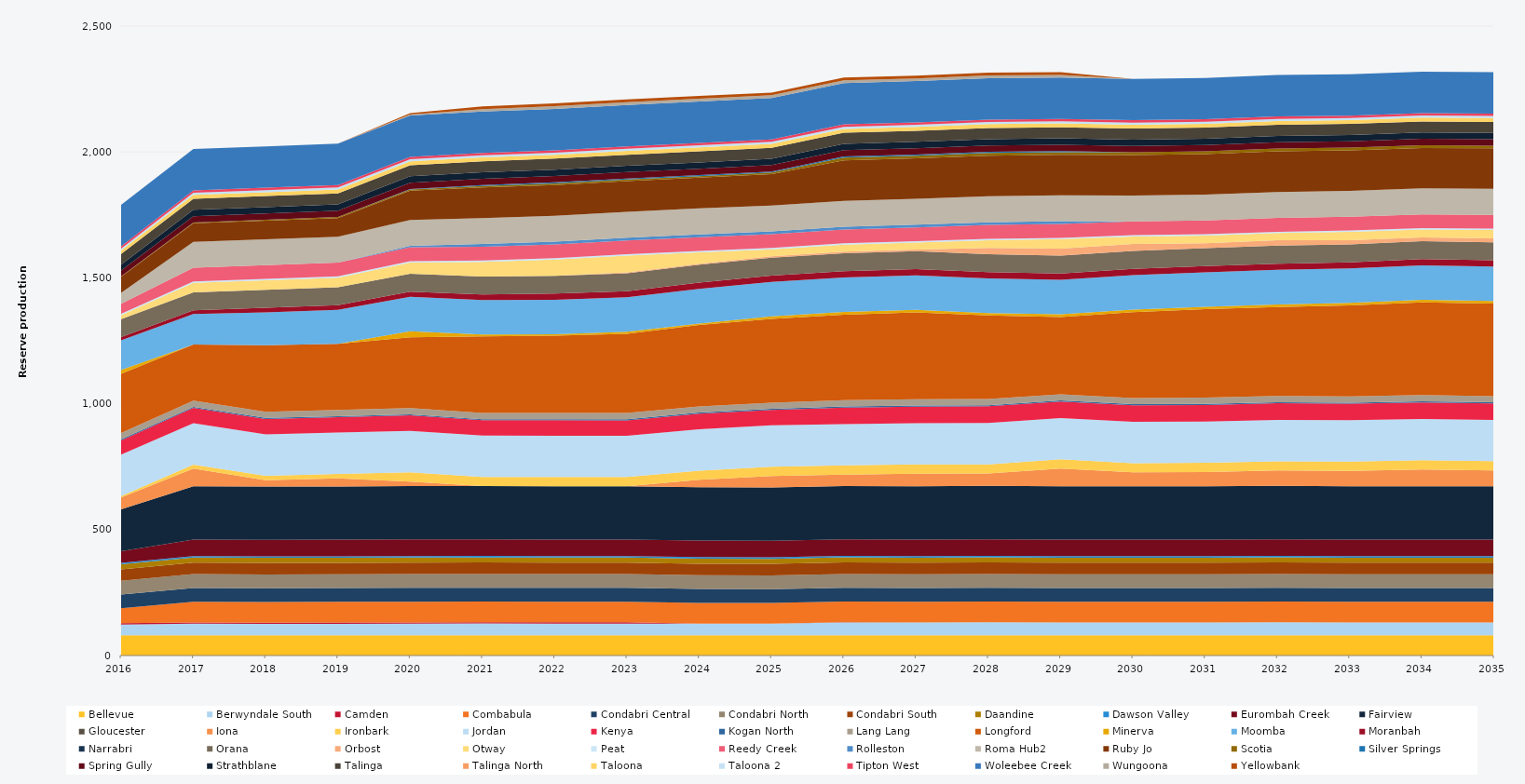
| Category | Bellevue | Berwyndale South | Camden | Combabula | Condabri Central | Condabri North | Condabri South | Daandine | Dawson Valley | Eurombah Creek | Fairview | Gloucester | Iona | Ironbark | Jordan | Kenya | Kogan North | Lang Lang | Longford | Minerva | Moomba | Moranbah | Narrabri | Orana | Orbost | Otway | Peat | Reedy Creek | Rolleston | Roma Hub2 | Ruby Jo | Scotia | Silver Springs | Spring Gully | Strathblane | Talinga | Talinga North | Taloona | Taloona 2 | Tipton West | Woleebee Creek | Wungoona | Yellowbank |
|---|---|---|---|---|---|---|---|---|---|---|---|---|---|---|---|---|---|---|---|---|---|---|---|---|---|---|---|---|---|---|---|---|---|---|---|---|---|---|---|---|---|---|---|
| 2016 | 80.52 | 42.569 | 5 | 59.72 | 54.531 | 54.233 | 45.411 | 20.13 | 5.856 | 46.485 | 166.484 | 0 | 46.481 | 5.468 | 164.7 | 57.139 | 4.392 | 24.522 | 235.041 | 16 | 117.302 | 13.144 | 0 | 71 | 0 | 15.606 | 5.49 | 39.37 | 0 | 43.648 | 64.114 | 1.431 | 0 | 23.636 | 22.628 | 43.268 | 0 | 13.215 | 7.494 | 9.516 | 164.7 | 0 | 0 |
| 2017 | 80.3 | 46.35 | 5 | 82.125 | 54.75 | 54.75 | 45.625 | 20.075 | 5.84 | 65.7 | 211.7 | 0 | 69.931 | 16.286 | 164.25 | 60.717 | 4.38 | 24.455 | 222.562 | 0 | 121.253 | 14.794 | 0 | 71.175 | 0 | 38 | 5.475 | 54.75 | 0 | 102.93 | 73.702 | 2.892 | 0 | 25.185 | 25.185 | 43.8 | 0 | 15.33 | 8.395 | 9.49 | 164.25 | 0 | 0 |
| 2018 | 80.3 | 45.256 | 5 | 82.125 | 54.75 | 54.75 | 45.625 | 20.075 | 5.84 | 65.7 | 211.7 | 0 | 24.61 | 18.209 | 164.25 | 60.986 | 4.38 | 24.455 | 264.315 | 0 | 130.904 | 17.995 | 0 | 71.175 | 0 | 38 | 5.475 | 54.75 | 0 | 102.93 | 73.702 | 3.443 | 0 | 25.185 | 25.185 | 43.8 | 0 | 15.33 | 8.395 | 9.49 | 164.25 | 0 | 0 |
| 2019 | 80.3 | 45.809 | 5 | 82.125 | 54.75 | 54.75 | 45.625 | 20.075 | 5.84 | 65.7 | 211.7 | 0 | 31.568 | 18.25 | 164.25 | 60.637 | 4.38 | 24.455 | 262.5 | 0 | 135.35 | 18.062 | 0 | 71.175 | 0 | 38 | 5.475 | 54.75 | 0 | 102.93 | 73.702 | 4.369 | 0 | 25.185 | 25.185 | 43.8 | 0 | 15.33 | 8.395 | 9.49 | 164.25 | 0 | 0 |
| 2020 | 80.52 | 45.819 | 5 | 82.35 | 54.9 | 54.9 | 45.75 | 20.13 | 5.856 | 65.88 | 212.28 | 0 | 17.669 | 36.6 | 164.7 | 61.465 | 4.392 | 24.522 | 281.351 | 23.79 | 137.25 | 19.632 | 0 | 71.37 | 0 | 44.818 | 5.49 | 54.9 | 5.586 | 103.212 | 116.254 | 4.854 | 1.484 | 25.254 | 25.254 | 43.92 | 0 | 15.372 | 8.418 | 9.516 | 164.7 | 3.712 | 5.638 |
| 2021 | 80.3 | 46.989 | 5 | 82.125 | 54.75 | 54.75 | 45.625 | 20.075 | 5.84 | 65.7 | 211.7 | 0 | 0 | 36.5 | 164.25 | 60.789 | 4.38 | 24.455 | 304.277 | 7.135 | 136.875 | 22.187 | 0 | 71.175 | 0 | 58.198 | 5.475 | 54.75 | 10.95 | 102.93 | 121.796 | 5.913 | 3.738 | 25.185 | 25.185 | 43.8 | 0 | 15.33 | 8.395 | 9.49 | 164.25 | 9.515 | 10.95 |
| 2022 | 80.3 | 46.551 | 5 | 82.125 | 54.75 | 54.75 | 45.625 | 20.075 | 5.84 | 65.7 | 211.7 | 0 | 0 | 36.5 | 164.25 | 61.28 | 4.38 | 24.455 | 306.648 | 6.283 | 136.875 | 24.144 | 0 | 71.175 | 0 | 64.339 | 5.475 | 54.75 | 10.95 | 102.93 | 121.752 | 6.351 | 4.38 | 25.185 | 25.185 | 43.8 | 0 | 15.33 | 8.395 | 9.49 | 164.25 | 10.95 | 10.95 |
| 2023 | 80.3 | 46.453 | 5 | 82.125 | 54.75 | 54.75 | 45.625 | 20.075 | 5.84 | 65.7 | 211.7 | 0 | 0 | 36.5 | 164.25 | 61.08 | 4.38 | 24.455 | 315.098 | 7.541 | 136.875 | 24.788 | 0 | 71.175 | 3.364 | 66.645 | 5.475 | 54.75 | 10.95 | 102.93 | 121.708 | 6.12 | 4.38 | 25.185 | 25.185 | 43.8 | 0 | 15.33 | 8.395 | 9.49 | 164.25 | 10.95 | 10.95 |
| 2024 | 80.52 | 46.257 | 0 | 82.35 | 54.9 | 54.9 | 45.75 | 20.13 | 5.856 | 65.88 | 212.28 | 0 | 28.83 | 36.6 | 164.7 | 61.672 | 4.392 | 24.522 | 323.245 | 5.909 | 137.25 | 24.888 | 0 | 71.37 | 3.84 | 45.403 | 5.49 | 54.9 | 10.98 | 103.212 | 121.963 | 5.751 | 4.392 | 25.254 | 25.254 | 43.92 | 0 | 15.372 | 8.418 | 9.516 | 164.7 | 10.98 | 10.98 |
| 2025 | 80.3 | 46.408 | 0 | 82.125 | 54.75 | 54.75 | 45.625 | 20.075 | 5.84 | 65.7 | 211.7 | 0 | 45.992 | 36.5 | 164.25 | 61.512 | 4.38 | 24.455 | 332.757 | 9.817 | 136.875 | 24.82 | 0 | 71.175 | 6.262 | 27.248 | 5.475 | 54.75 | 10.95 | 102.93 | 124.413 | 6.236 | 4.38 | 25.185 | 25.185 | 43.8 | 0 | 15.33 | 8.395 | 9.49 | 164.25 | 10.95 | 10.95 |
| 2026 | 80.3 | 51.1 | 1 | 82.125 | 54.75 | 54.75 | 45.625 | 20.075 | 5.84 | 65.7 | 211.7 | 0 | 45.664 | 36.5 | 164.25 | 65.7 | 4.38 | 24.455 | 339.537 | 11.376 | 136.875 | 24.82 | 0 | 71.175 | 6.381 | 27.884 | 5.475 | 54.75 | 10.95 | 102.93 | 160.6 | 10.95 | 4.38 | 25.185 | 25.185 | 43.8 | 0 | 15.33 | 8.395 | 9.49 | 164.25 | 10.95 | 10.95 |
| 2027 | 80.3 | 51.1 | 0 | 82.125 | 54.75 | 54.75 | 45.625 | 20.075 | 5.84 | 65.7 | 211.7 | 0 | 50.291 | 36.5 | 164.25 | 65.7 | 4.38 | 24.455 | 345.189 | 10.059 | 136.875 | 24.82 | 0 | 71.175 | 6.937 | 27.178 | 5.475 | 54.75 | 10.95 | 102.93 | 160.6 | 10.95 | 4.38 | 25.185 | 25.185 | 43.8 | 0 | 15.33 | 8.395 | 9.49 | 164.25 | 10.95 | 10.95 |
| 2028 | 80.52 | 51.24 | 0 | 82.35 | 54.9 | 54.9 | 45.75 | 20.13 | 5.856 | 65.88 | 212.28 | 0 | 48.895 | 36.6 | 164.7 | 65.88 | 4.392 | 24.522 | 332.301 | 9.34 | 137.25 | 24.888 | 0 | 71.37 | 24.931 | 30.75 | 5.49 | 54.9 | 10.98 | 103.212 | 161.04 | 10.98 | 4.392 | 25.254 | 25.254 | 43.92 | 0 | 15.372 | 8.418 | 9.516 | 164.7 | 10.98 | 10.98 |
| 2029 | 80.3 | 51.1 | 0 | 82.125 | 54.75 | 54.75 | 45.625 | 20.075 | 5.84 | 65.7 | 211.7 | 0 | 70.492 | 36.5 | 164.25 | 65.7 | 4.38 | 24.455 | 306.869 | 10.94 | 136.875 | 24.82 | 0 | 71.175 | 27.375 | 37.838 | 5.475 | 54.75 | 10.92 | 102.93 | 160.6 | 10.95 | 4.38 | 25.185 | 25.185 | 43.8 | 0 | 15.33 | 8.395 | 9.49 | 164.25 | 10.95 | 10.877 |
| 2030 | 80.3 | 51.1 | 0 | 82.125 | 54.75 | 54.75 | 45.625 | 20.075 | 5.84 | 65.7 | 211.7 | 0 | 55.654 | 36.5 | 164.25 | 65.7 | 4.38 | 24.455 | 341.19 | 9.885 | 136.875 | 24.82 | 0 | 71.175 | 27.375 | 29.71 | 5.475 | 54.75 | 0 | 102.93 | 160.6 | 10.95 | 0 | 25.185 | 25.185 | 43.8 | 0 | 15.33 | 8.395 | 9.49 | 164.25 | 0 | 0 |
| 2031 | 80.3 | 51.1 | 0 | 82.125 | 54.75 | 54.75 | 45.625 | 20.075 | 5.84 | 65.7 | 211.7 | 0 | 56.705 | 36.5 | 164.25 | 65.7 | 4.38 | 24.455 | 351.891 | 9.432 | 136.875 | 24.82 | 0 | 71.175 | 18.956 | 30.719 | 5.475 | 54.75 | 0 | 102.93 | 160.6 | 10.95 | 0 | 25.185 | 25.185 | 43.8 | 0 | 15.33 | 8.395 | 9.49 | 164.25 | 0 | 0 |
| 2032 | 80.52 | 51.24 | 0 | 82.35 | 54.9 | 54.9 | 45.75 | 20.13 | 5.856 | 65.88 | 212.28 | 0 | 60.788 | 36.6 | 164.7 | 65.88 | 4.392 | 24.522 | 353.692 | 9.962 | 137.25 | 24.888 | 0 | 71.37 | 21.12 | 28.66 | 5.49 | 54.9 | 0 | 103.212 | 161.04 | 10.98 | 0 | 25.254 | 25.254 | 43.92 | 0 | 15.372 | 8.418 | 9.516 | 164.7 | 0 | 0 |
| 2033 | 80.3 | 51.1 | 0 | 82.125 | 54.75 | 54.75 | 45.625 | 20.075 | 5.84 | 65.7 | 211.7 | 0 | 61.621 | 36.5 | 164.25 | 65.7 | 4.38 | 24.455 | 361.413 | 10.005 | 136.875 | 24.82 | 0 | 71.175 | 16.645 | 32.609 | 5.475 | 54.75 | 0 | 102.93 | 160.6 | 10.95 | 0 | 25.185 | 25.185 | 43.8 | 0 | 15.33 | 8.395 | 9.49 | 164.25 | 0 | 0 |
| 2034 | 80.3 | 51.1 | 0 | 82.125 | 54.75 | 54.75 | 45.625 | 20.075 | 5.84 | 65.7 | 211.7 | 0 | 66.882 | 36.5 | 164.25 | 65.7 | 4.38 | 24.455 | 368.025 | 10.799 | 136.875 | 24.82 | 0 | 71.175 | 15.064 | 31.322 | 5.475 | 54.75 | 0 | 102.93 | 160.6 | 10.95 | 0 | 25.185 | 25.185 | 43.8 | 0 | 15.33 | 8.395 | 9.49 | 164.25 | 0 | 0 |
| 2035 | 80.3 | 51.1 | 0 | 82.125 | 54.75 | 54.75 | 45.625 | 20.075 | 5.84 | 65.7 | 211.7 | 0 | 63.028 | 36.5 | 164.25 | 65.7 | 4.38 | 24.455 | 367.134 | 10.444 | 136.875 | 24.82 | 0 | 71.175 | 15.791 | 33.868 | 5.475 | 54.75 | 0 | 102.93 | 160.6 | 10.95 | 0 | 25.185 | 25.185 | 43.8 | 0 | 15.33 | 8.395 | 9.49 | 164.25 | 0 | 0 |